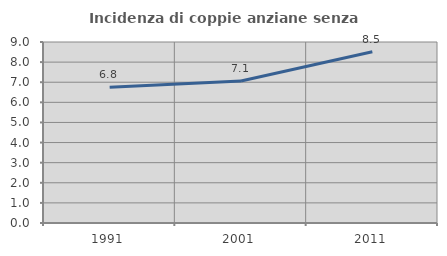
| Category | Incidenza di coppie anziane senza figli  |
|---|---|
| 1991.0 | 6.753 |
| 2001.0 | 7.065 |
| 2011.0 | 8.518 |